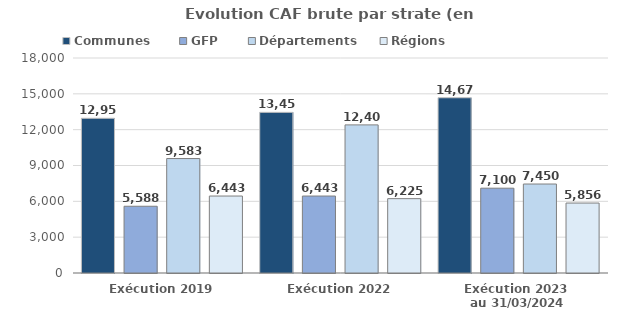
| Category | Communes  | GFP | Départements | Régions |
|---|---|---|---|---|
| Exécution 2019 | 12954.3 | 5588 | 9583 | 6443.1 |
| Exécution 2022 | 13449.9 | 6443.2 | 12401 | 6224.6 |
| Exécution 2023 
au 31/03/2024 | 14671 | 7100.3 | 7449.8 | 5856.3 |